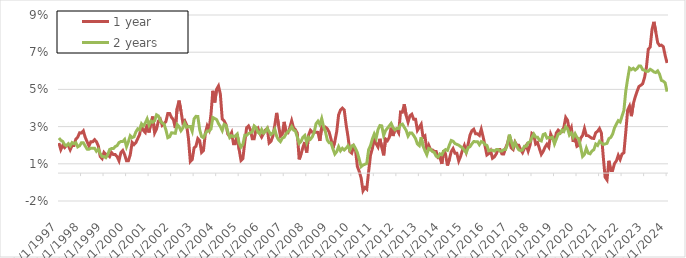
| Category | 1 year | 2 years |
|---|---|---|
| 1/1/97 | 0.016 | 0.019 |
| 2/1/97 | 0.013 | 0.018 |
| 3/1/97 | 0.015 | 0.017 |
| 4/1/97 | 0.014 | 0.015 |
| 5/1/97 | 0.015 | 0.015 |
| 6/1/97 | 0.015 | 0.016 |
| 7/1/97 | 0.013 | 0.015 |
| 8/1/97 | 0.015 | 0.016 |
| 9/1/97 | 0.015 | 0.016 |
| 10/1/97 | 0.018 | 0.016 |
| 11/1/97 | 0.019 | 0.014 |
| 12/1/97 | 0.022 | 0.015 |
| 1/1/98 | 0.022 | 0.016 |
| 2/1/98 | 0.023 | 0.016 |
| 3/1/98 | 0.019 | 0.015 |
| 4/1/98 | 0.017 | 0.013 |
| 5/1/98 | 0.015 | 0.013 |
| 6/1/98 | 0.017 | 0.013 |
| 7/1/98 | 0.017 | 0.013 |
| 8/1/98 | 0.018 | 0.013 |
| 9/1/98 | 0.017 | 0.012 |
| 10/1/98 | 0.015 | 0.013 |
| 11/1/98 | 0.009 | 0.011 |
| 12/1/98 | 0.008 | 0.009 |
| 1/1/99 | 0.011 | 0.009 |
| 2/1/99 | 0.01 | 0.008 |
| 3/1/99 | 0.01 | 0.01 |
| 4/1/99 | 0.009 | 0.013 |
| 5/1/99 | 0.011 | 0.013 |
| 6/1/99 | 0.01 | 0.013 |
| 7/1/99 | 0.01 | 0.014 |
| 8/1/99 | 0.009 | 0.015 |
| 9/1/99 | 0.007 | 0.016 |
| 10/1/99 | 0.011 | 0.017 |
| 11/1/99 | 0.012 | 0.017 |
| 12/1/99 | 0.01 | 0.018 |
| 1/1/00 | 0.007 | 0.014 |
| 2/1/00 | 0.007 | 0.017 |
| 3/1/00 | 0.01 | 0.02 |
| 4/1/00 | 0.016 | 0.019 |
| 5/1/00 | 0.015 | 0.02 |
| 6/1/00 | 0.016 | 0.022 |
| 7/1/00 | 0.019 | 0.024 |
| 8/1/00 | 0.021 | 0.023 |
| 9/1/00 | 0.026 | 0.027 |
| 10/1/00 | 0.023 | 0.025 |
| 11/1/00 | 0.022 | 0.027 |
| 12/1/00 | 0.026 | 0.029 |
| 1/1/01 | 0.022 | 0.026 |
| 2/1/01 | 0.027 | 0.028 |
| 3/1/01 | 0.03 | 0.027 |
| 4/1/01 | 0.022 | 0.028 |
| 5/1/01 | 0.024 | 0.031 |
| 6/1/01 | 0.028 | 0.031 |
| 7/1/01 | 0.029 | 0.028 |
| 8/1/01 | 0.026 | 0.027 |
| 9/1/01 | 0.027 | 0.026 |
| 10/1/01 | 0.028 | 0.023 |
| 11/1/01 | 0.032 | 0.019 |
| 12/1/01 | 0.032 | 0.02 |
| 1/1/02 | 0.03 | 0.022 |
| 2/1/02 | 0.029 | 0.022 |
| 3/1/02 | 0.024 | 0.021 |
| 4/1/02 | 0.035 | 0.026 |
| 5/1/02 | 0.039 | 0.025 |
| 6/1/02 | 0.034 | 0.023 |
| 7/1/02 | 0.027 | 0.024 |
| 8/1/02 | 0.028 | 0.027 |
| 9/1/02 | 0.026 | 0.025 |
| 10/1/02 | 0.019 | 0.025 |
| 11/1/02 | 0.006 | 0.025 |
| 12/1/02 | 0.007 | 0.022 |
| 1/1/03 | 0.013 | 0.029 |
| 2/1/03 | 0.014 | 0.031 |
| 3/1/03 | 0.019 | 0.03 |
| 4/1/03 | 0.017 | 0.023 |
| 5/1/03 | 0.011 | 0.02 |
| 6/1/03 | 0.012 | 0.019 |
| 7/1/03 | 0.021 | 0.021 |
| 8/1/03 | 0.025 | 0.023 |
| 9/1/03 | 0.023 | 0.023 |
| 10/1/03 | 0.032 | 0.024 |
| 11/1/03 | 0.044 | 0.03 |
| 12/1/03 | 0.038 | 0.029 |
| 1/1/04 | 0.045 | 0.029 |
| 2/1/04 | 0.047 | 0.027 |
| 3/1/04 | 0.042 | 0.025 |
| 4/1/04 | 0.029 | 0.023 |
| 5/1/04 | 0.028 | 0.026 |
| 6/1/04 | 0.026 | 0.026 |
| 7/1/04 | 0.021 | 0.022 |
| 8/1/04 | 0.02 | 0.019 |
| 9/1/04 | 0.022 | 0.02 |
| 10/1/04 | 0.016 | 0.02 |
| 11/1/04 | 0.016 | 0.02 |
| 12/1/04 | 0.021 | 0.021 |
| 1/1/05 | 0.013 | 0.016 |
| 2/1/05 | 0.007 | 0.014 |
| 3/1/05 | 0.008 | 0.015 |
| 4/1/05 | 0.017 | 0.02 |
| 5/1/05 | 0.024 | 0.02 |
| 6/1/05 | 0.025 | 0.021 |
| 7/1/05 | 0.023 | 0.022 |
| 8/1/05 | 0.018 | 0.022 |
| 9/1/05 | 0.018 | 0.025 |
| 10/1/05 | 0.023 | 0.025 |
| 11/1/05 | 0.024 | 0.022 |
| 12/1/05 | 0.021 | 0.021 |
| 1/1/06 | 0.019 | 0.023 |
| 2/1/06 | 0.021 | 0.022 |
| 3/1/06 | 0.023 | 0.022 |
| 4/1/06 | 0.024 | 0.024 |
| 5/1/06 | 0.016 | 0.022 |
| 6/1/06 | 0.017 | 0.021 |
| 7/1/06 | 0.02 | 0.022 |
| 8/1/06 | 0.026 | 0.024 |
| 9/1/06 | 0.032 | 0.02 |
| 10/1/06 | 0.026 | 0.018 |
| 11/1/06 | 0.02 | 0.017 |
| 12/1/06 | 0.021 | 0.019 |
| 1/1/07 | 0.028 | 0.019 |
| 2/1/07 | 0.022 | 0.021 |
| 3/1/07 | 0.022 | 0.022 |
| 4/1/07 | 0.024 | 0.023 |
| 5/1/07 | 0.028 | 0.025 |
| 6/1/07 | 0.024 | 0.023 |
| 7/1/07 | 0.023 | 0.023 |
| 8/1/07 | 0.021 | 0.019 |
| 9/1/07 | 0.007 | 0.016 |
| 10/1/07 | 0.01 | 0.017 |
| 11/1/07 | 0.014 | 0.019 |
| 12/1/07 | 0.017 | 0.02 |
| 1/1/08 | 0.011 | 0.016 |
| 2/1/08 | 0.02 | 0.019 |
| 3/1/08 | 0.023 | 0.018 |
| 4/1/08 | 0.022 | 0.019 |
| 5/1/08 | 0.022 | 0.022 |
| 6/1/08 | 0.022 | 0.027 |
| 7/1/08 | 0.022 | 0.028 |
| 8/1/08 | 0.017 | 0.026 |
| 9/1/08 | 0.025 | 0.029 |
| 10/1/08 | 0.024 | 0.025 |
| 11/1/08 | 0.025 | 0.022 |
| 12/1/08 | 0.024 | 0.018 |
| 1/1/09 | 0.022 | 0.016 |
| 2/1/09 | 0.018 | 0.016 |
| 3/1/09 | 0.014 | 0.013 |
| 4/1/09 | 0.017 | 0.01 |
| 5/1/09 | 0.022 | 0.012 |
| 6/1/09 | 0.031 | 0.014 |
| 7/1/09 | 0.034 | 0.012 |
| 8/1/09 | 0.035 | 0.013 |
| 9/1/09 | 0.034 | 0.012 |
| 10/1/09 | 0.026 | 0.013 |
| 11/1/09 | 0.02 | 0.015 |
| 12/1/09 | 0.012 | 0.012 |
| 1/1/10 | 0.011 | 0.015 |
| 2/1/10 | 0.014 | 0.015 |
| 3/1/10 | 0.012 | 0.013 |
| 4/1/10 | 0.004 | 0.011 |
| 5/1/10 | 0.001 | 0.007 |
| 6/1/10 | -0.003 | 0.003 |
| 7/1/10 | -0.009 | 0.004 |
| 8/1/10 | -0.008 | 0.005 |
| 9/1/10 | -0.009 | 0.005 |
| 10/1/10 | 0.001 | 0.013 |
| 11/1/10 | 0.01 | 0.015 |
| 12/1/10 | 0.013 | 0.018 |
| 1/1/11 | 0.019 | 0.021 |
| 2/1/11 | 0.016 | 0.019 |
| 3/1/11 | 0.014 | 0.023 |
| 4/1/11 | 0.018 | 0.026 |
| 5/1/11 | 0.014 | 0.025 |
| 6/1/11 | 0.01 | 0.02 |
| 7/1/11 | 0.018 | 0.023 |
| 8/1/11 | 0.017 | 0.024 |
| 9/1/11 | 0.019 | 0.025 |
| 10/1/11 | 0.024 | 0.027 |
| 11/1/11 | 0.02 | 0.024 |
| 12/1/11 | 0.024 | 0.023 |
| 1/1/12 | 0.023 | 0.024 |
| 2/1/12 | 0.022 | 0.024 |
| 3/1/12 | 0.033 | 0.026 |
| 4/1/12 | 0.033 | 0.026 |
| 5/1/12 | 0.037 | 0.025 |
| 6/1/12 | 0.031 | 0.023 |
| 7/1/12 | 0.027 | 0.02 |
| 8/1/12 | 0.031 | 0.022 |
| 9/1/12 | 0.032 | 0.022 |
| 10/1/12 | 0.029 | 0.02 |
| 11/1/12 | 0.029 | 0.019 |
| 12/1/12 | 0.023 | 0.016 |
| 1/1/13 | 0.025 | 0.015 |
| 2/1/13 | 0.026 | 0.019 |
| 3/1/13 | 0.019 | 0.015 |
| 4/1/13 | 0.02 | 0.012 |
| 5/1/13 | 0.012 | 0.01 |
| 6/1/13 | 0.015 | 0.013 |
| 7/1/13 | 0.012 | 0.013 |
| 8/1/13 | 0.012 | 0.012 |
| 9/1/13 | 0.012 | 0.011 |
| 10/1/13 | 0.012 | 0.009 |
| 11/1/13 | 0.008 | 0.009 |
| 12/1/13 | 0.008 | 0.01 |
| 1/1/14 | 0.005 | 0.01 |
| 2/1/14 | 0.012 | 0.012 |
| 3/1/14 | 0.01 | 0.013 |
| 4/1/14 | 0.004 | 0.012 |
| 5/1/14 | 0.007 | 0.015 |
| 6/1/14 | 0.012 | 0.018 |
| 7/1/14 | 0.013 | 0.017 |
| 8/1/14 | 0.011 | 0.016 |
| 9/1/14 | 0.011 | 0.015 |
| 10/1/14 | 0.007 | 0.015 |
| 11/1/14 | 0.009 | 0.014 |
| 12/1/14 | 0.012 | 0.014 |
| 1/1/15 | 0.015 | 0.012 |
| 2/1/15 | 0.011 | 0.011 |
| 3/1/15 | 0.015 | 0.014 |
| 4/1/15 | 0.02 | 0.014 |
| 5/1/15 | 0.023 | 0.016 |
| 6/1/15 | 0.024 | 0.017 |
| 7/1/15 | 0.021 | 0.017 |
| 8/1/15 | 0.021 | 0.017 |
| 9/1/15 | 0.02 | 0.015 |
| 10/1/15 | 0.024 | 0.017 |
| 11/1/15 | 0.02 | 0.017 |
| 12/1/15 | 0.015 | 0.015 |
| 1/1/16 | 0.01 | 0.015 |
| 2/1/16 | 0.01 | 0.012 |
| 3/1/16 | 0.012 | 0.012 |
| 4/1/16 | 0.008 | 0.012 |
| 5/1/16 | 0.009 | 0.012 |
| 6/1/16 | 0.01 | 0.013 |
| 7/1/16 | 0.013 | 0.013 |
| 8/1/16 | 0.013 | 0.012 |
| 9/1/16 | 0.01 | 0.012 |
| 10/1/16 | 0.01 | 0.013 |
| 11/1/16 | 0.014 | 0.013 |
| 12/1/16 | 0.016 | 0.016 |
| 1/1/17 | 0.02 | 0.021 |
| 2/1/17 | 0.014 | 0.017 |
| 3/1/17 | 0.013 | 0.014 |
| 4/1/17 | 0.017 | 0.017 |
| 5/1/17 | 0.015 | 0.014 |
| 6/1/17 | 0.015 | 0.013 |
| 7/1/17 | 0.013 | 0.012 |
| 8/1/17 | 0.011 | 0.012 |
| 9/1/17 | 0.013 | 0.014 |
| 10/1/17 | 0.015 | 0.014 |
| 11/1/17 | 0.012 | 0.016 |
| 12/1/17 | 0.015 | 0.017 |
| 1/1/18 | 0.021 | 0.019 |
| 2/1/18 | 0.02 | 0.021 |
| 3/1/18 | 0.016 | 0.019 |
| 4/1/18 | 0.016 | 0.019 |
| 5/1/18 | 0.013 | 0.018 |
| 6/1/18 | 0.01 | 0.017 |
| 7/1/18 | 0.012 | 0.021 |
| 8/1/18 | 0.014 | 0.021 |
| 9/1/18 | 0.016 | 0.019 |
| 10/1/18 | 0.014 | 0.019 |
| 11/1/18 | 0.021 | 0.019 |
| 12/1/18 | 0.019 | 0.019 |
| 1/1/19 | 0.017 | 0.016 |
| 2/1/19 | 0.022 | 0.018 |
| 3/1/19 | 0.023 | 0.021 |
| 4/1/19 | 0.022 | 0.021 |
| 5/1/19 | 0.022 | 0.023 |
| 6/1/19 | 0.025 | 0.022 |
| 7/1/19 | 0.03 | 0.025 |
| 8/1/19 | 0.028 | 0.024 |
| 9/1/19 | 0.022 | 0.02 |
| 10/1/19 | 0.024 | 0.022 |
| 11/1/19 | 0.017 | 0.019 |
| 12/1/19 | 0.02 | 0.021 |
| 1/1/20 | 0.014 | 0.019 |
| 2/1/20 | 0.015 | 0.018 |
| 3/1/20 | 0.019 | 0.014 |
| 4/1/20 | 0.02 | 0.009 |
| 5/1/20 | 0.024 | 0.01 |
| 6/1/20 | 0.02 | 0.013 |
| 7/1/20 | 0.02 | 0.011 |
| 8/1/20 | 0.019 | 0.01 |
| 9/1/20 | 0.019 | 0.012 |
| 10/1/20 | 0.019 | 0.013 |
| 11/1/20 | 0.022 | 0.016 |
| 12/1/20 | 0.022 | 0.015 |
| 1/1/21 | 0.024 | 0.017 |
| 2/1/21 | 0.022 | 0.016 |
| 3/1/21 | 0.009 | 0.015 |
| 4/1/21 | -0.002 | 0.016 |
| 5/1/21 | -0.004 | 0.016 |
| 6/1/21 | 0.007 | 0.019 |
| 7/1/21 | 0.001 | 0.019 |
| 8/1/21 | 0.001 | 0.021 |
| 9/1/21 | 0.005 | 0.024 |
| 10/1/21 | 0.007 | 0.026 |
| 11/1/21 | 0.01 | 0.028 |
| 12/1/21 | 0.007 | 0.027 |
| 1/1/22 | 0.01 | 0.031 |
| 2/1/22 | 0.011 | 0.034 |
| 3/1/22 | 0.022 | 0.044 |
| 4/1/22 | 0.034 | 0.051 |
| 5/1/22 | 0.036 | 0.056 |
| 6/1/22 | 0.031 | 0.056 |
| 7/1/22 | 0.037 | 0.056 |
| 8/1/22 | 0.041 | 0.055 |
| 9/1/22 | 0.044 | 0.056 |
| 10/1/22 | 0.047 | 0.058 |
| 11/1/22 | 0.047 | 0.058 |
| 12/1/22 | 0.048 | 0.056 |
| 1/1/23 | 0.051 | 0.055 |
| 2/1/23 | 0.057 | 0.055 |
| 3/1/23 | 0.067 | 0.055 |
| 4/1/23 | 0.068 | 0.056 |
| 5/1/23 | 0.077 | 0.055 |
| 6/1/23 | 0.081 | 0.054 |
| 7/1/23 | 0.076 | 0.054 |
| 8/1/23 | 0.07 | 0.055 |
| 9/1/23 | 0.069 | 0.053 |
| 10/1/23 | 0.069 | 0.05 |
| 11/1/23 | 0.068 | 0.049 |
| 12/1/23 | 0.063 | 0.048 |
| 1/1/24 | 0.059 | 0.044 |